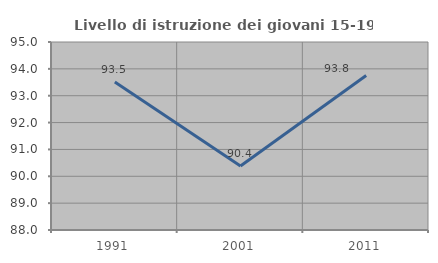
| Category | Livello di istruzione dei giovani 15-19 anni |
|---|---|
| 1991.0 | 93.506 |
| 2001.0 | 90.385 |
| 2011.0 | 93.75 |